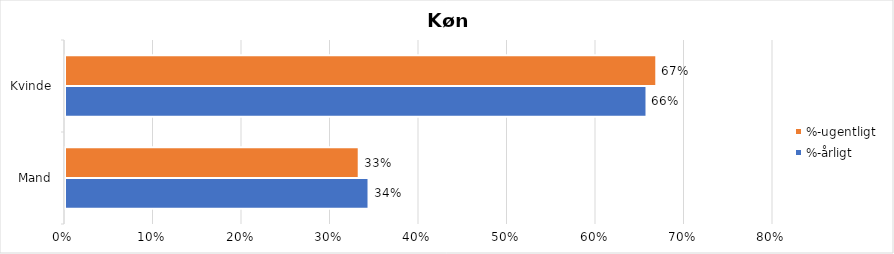
| Category | %-årligt | %-ugentligt |
|---|---|---|
| Mand | 0.343 | 0.332 |
| Kvinde | 0.657 | 0.668 |